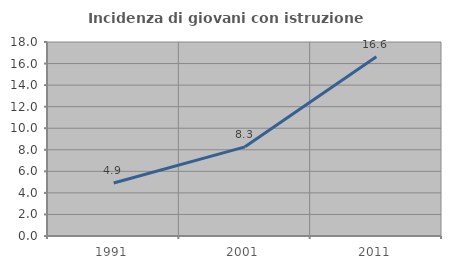
| Category | Incidenza di giovani con istruzione universitaria |
|---|---|
| 1991.0 | 4.915 |
| 2001.0 | 8.272 |
| 2011.0 | 16.64 |